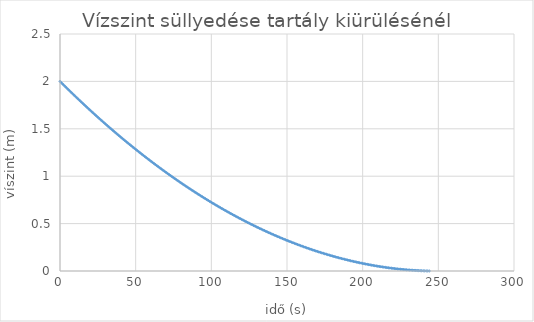
| Category | Series 0 |
|---|---|
| 0.0 | 2 |
| 1.0 | 1.984 |
| 2.0 | 1.968 |
| 3.0 | 1.953 |
| 4.0 | 1.937 |
| 5.0 | 1.921 |
| 6.0 | 1.906 |
| 7.0 | 1.89 |
| 8.0 | 1.875 |
| 9.0 | 1.86 |
| 10.0 | 1.844 |
| 11.0 | 1.829 |
| 12.0 | 1.814 |
| 13.0 | 1.799 |
| 14.0 | 1.784 |
| 15.0 | 1.769 |
| 16.0 | 1.754 |
| 17.0 | 1.739 |
| 18.0 | 1.724 |
| 19.0 | 1.709 |
| 20.0 | 1.695 |
| 21.0 | 1.68 |
| 22.0 | 1.665 |
| 23.0 | 1.651 |
| 24.0 | 1.637 |
| 25.0 | 1.622 |
| 26.0 | 1.608 |
| 27.0 | 1.594 |
| 28.0 | 1.579 |
| 29.0 | 1.565 |
| 30.0 | 1.551 |
| 31.0 | 1.537 |
| 32.0 | 1.523 |
| 33.0 | 1.51 |
| 34.0 | 1.496 |
| 35.0 | 1.482 |
| 36.0 | 1.468 |
| 37.0 | 1.455 |
| 38.0 | 1.441 |
| 39.0 | 1.428 |
| 40.0 | 1.414 |
| 41.0 | 1.401 |
| 42.0 | 1.388 |
| 43.0 | 1.374 |
| 44.0 | 1.361 |
| 45.0 | 1.348 |
| 46.0 | 1.335 |
| 47.0 | 1.322 |
| 48.0 | 1.309 |
| 49.0 | 1.296 |
| 50.0 | 1.283 |
| 51.0 | 1.271 |
| 52.0 | 1.258 |
| 53.0 | 1.245 |
| 54.0 | 1.233 |
| 55.0 | 1.22 |
| 56.0 | 1.208 |
| 57.0 | 1.196 |
| 58.0 | 1.183 |
| 59.0 | 1.171 |
| 60.0 | 1.159 |
| 61.0 | 1.147 |
| 62.0 | 1.135 |
| 63.0 | 1.123 |
| 64.0 | 1.111 |
| 65.0 | 1.099 |
| 66.0 | 1.087 |
| 67.0 | 1.076 |
| 68.0 | 1.064 |
| 69.0 | 1.052 |
| 70.0 | 1.041 |
| 71.0 | 1.029 |
| 72.0 | 1.018 |
| 73.0 | 1.007 |
| 74.0 | 0.995 |
| 75.0 | 0.984 |
| 76.0 | 0.973 |
| 77.0 | 0.962 |
| 78.0 | 0.951 |
| 79.0 | 0.94 |
| 80.0 | 0.929 |
| 81.0 | 0.918 |
| 82.0 | 0.907 |
| 83.0 | 0.897 |
| 84.0 | 0.886 |
| 85.0 | 0.875 |
| 86.0 | 0.865 |
| 87.0 | 0.854 |
| 88.0 | 0.844 |
| 89.0 | 0.834 |
| 90.0 | 0.823 |
| 91.0 | 0.813 |
| 92.0 | 0.803 |
| 93.0 | 0.793 |
| 94.0 | 0.783 |
| 95.0 | 0.773 |
| 96.0 | 0.763 |
| 97.0 | 0.753 |
| 98.0 | 0.744 |
| 99.0 | 0.734 |
| 100.0 | 0.724 |
| 101.0 | 0.715 |
| 102.0 | 0.705 |
| 103.0 | 0.696 |
| 104.0 | 0.686 |
| 105.0 | 0.677 |
| 106.0 | 0.668 |
| 107.0 | 0.658 |
| 108.0 | 0.649 |
| 109.0 | 0.64 |
| 110.0 | 0.631 |
| 111.0 | 0.622 |
| 112.0 | 0.613 |
| 113.0 | 0.605 |
| 114.0 | 0.596 |
| 115.0 | 0.587 |
| 116.0 | 0.579 |
| 117.0 | 0.57 |
| 118.0 | 0.561 |
| 119.0 | 0.553 |
| 120.0 | 0.545 |
| 121.0 | 0.536 |
| 122.0 | 0.528 |
| 123.0 | 0.52 |
| 124.0 | 0.512 |
| 125.0 | 0.504 |
| 126.0 | 0.496 |
| 127.0 | 0.488 |
| 128.0 | 0.48 |
| 129.0 | 0.472 |
| 130.0 | 0.464 |
| 131.0 | 0.457 |
| 132.0 | 0.449 |
| 133.0 | 0.441 |
| 134.0 | 0.434 |
| 135.0 | 0.427 |
| 136.0 | 0.419 |
| 137.0 | 0.412 |
| 138.0 | 0.405 |
| 139.0 | 0.397 |
| 140.0 | 0.39 |
| 141.0 | 0.383 |
| 142.0 | 0.376 |
| 143.0 | 0.369 |
| 144.0 | 0.363 |
| 145.0 | 0.356 |
| 146.0 | 0.349 |
| 147.0 | 0.342 |
| 148.0 | 0.336 |
| 149.0 | 0.329 |
| 150.0 | 0.323 |
| 151.0 | 0.316 |
| 152.0 | 0.31 |
| 153.0 | 0.304 |
| 154.0 | 0.297 |
| 155.0 | 0.291 |
| 156.0 | 0.285 |
| 157.0 | 0.279 |
| 158.0 | 0.273 |
| 159.0 | 0.267 |
| 160.0 | 0.261 |
| 161.0 | 0.256 |
| 162.0 | 0.25 |
| 163.0 | 0.244 |
| 164.0 | 0.239 |
| 165.0 | 0.233 |
| 166.0 | 0.228 |
| 167.0 | 0.222 |
| 168.0 | 0.217 |
| 169.0 | 0.212 |
| 170.0 | 0.207 |
| 171.0 | 0.201 |
| 172.0 | 0.196 |
| 173.0 | 0.191 |
| 174.0 | 0.186 |
| 175.0 | 0.181 |
| 176.0 | 0.177 |
| 177.0 | 0.172 |
| 178.0 | 0.167 |
| 179.0 | 0.163 |
| 180.0 | 0.158 |
| 181.0 | 0.153 |
| 182.0 | 0.149 |
| 183.0 | 0.145 |
| 184.0 | 0.14 |
| 185.0 | 0.136 |
| 186.0 | 0.132 |
| 187.0 | 0.128 |
| 188.0 | 0.124 |
| 189.0 | 0.12 |
| 190.0 | 0.116 |
| 191.0 | 0.112 |
| 192.0 | 0.108 |
| 193.0 | 0.104 |
| 194.0 | 0.101 |
| 195.0 | 0.097 |
| 196.0 | 0.093 |
| 197.0 | 0.09 |
| 198.0 | 0.087 |
| 199.0 | 0.083 |
| 200.0 | 0.08 |
| 201.0 | 0.077 |
| 202.0 | 0.074 |
| 203.0 | 0.07 |
| 204.0 | 0.067 |
| 205.0 | 0.064 |
| 206.0 | 0.062 |
| 207.0 | 0.059 |
| 208.0 | 0.056 |
| 209.0 | 0.053 |
| 210.0 | 0.051 |
| 211.0 | 0.048 |
| 212.0 | 0.045 |
| 213.0 | 0.043 |
| 214.0 | 0.041 |
| 215.0 | 0.038 |
| 216.0 | 0.036 |
| 217.0 | 0.034 |
| 218.0 | 0.032 |
| 219.0 | 0.03 |
| 220.0 | 0.028 |
| 221.0 | 0.026 |
| 222.0 | 0.024 |
| 223.0 | 0.022 |
| 224.0 | 0.02 |
| 225.0 | 0.019 |
| 226.0 | 0.017 |
| 227.0 | 0.016 |
| 228.0 | 0.014 |
| 229.0 | 0.013 |
| 230.0 | 0.011 |
| 231.0 | 0.01 |
| 232.0 | 0.009 |
| 233.0 | 0.008 |
| 234.0 | 0.007 |
| 235.0 | 0.006 |
| 236.0 | 0.005 |
| 237.0 | 0.004 |
| 238.0 | 0.003 |
| 239.0 | 0.003 |
| 240.0 | 0.002 |
| 241.0 | 0.001 |
| 242.0 | 0.001 |
| 243.0 | 0 |
| 244.0 | 0 |